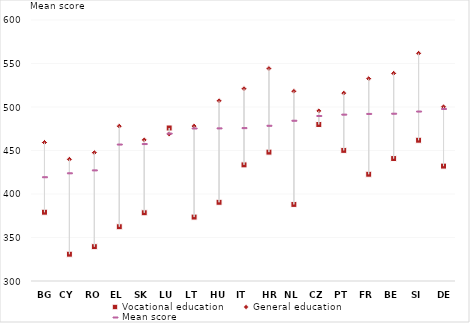
| Category | Vocational education | General education | Mean score |
|---|---|---|---|
| BG | 379.06 | 459.204 | 419.844 |
| CY | 330.81 | 439.889 | 424.358 |
| RO | 339.455 | 447.496 | 427.703 |
| EL | 362.366 | 477.931 | 457.414 |
| SK | 378.426 | 462.156 | 457.984 |
| LU | 475.863 | 468.993 | 469.985 |
| LT | 373.476 | 478.013 | 475.873 |
| HU | 390.468 | 507.209 | 475.987 |
| IT | 433.47 | 521.051 | 476.285 |
| HR | 448.122 | 544.199 | 478.989 |
| NL | 388.035 | 517.98 | 484.784 |
| CZ | 479.886 | 495.508 | 490.219 |
| PT | 450.138 | 515.939 | 491.801 |
| FR | 422.709 | 532.538 | 492.606 |
| BE | 440.745 | 538.67 | 492.864 |
| SI | 461.803 | 561.739 | 495.346 |
| DE | 432.064 | 500.204 | 498.279 |